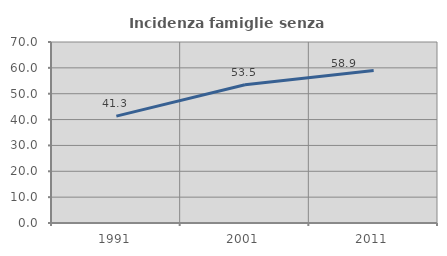
| Category | Incidenza famiglie senza nuclei |
|---|---|
| 1991.0 | 41.317 |
| 2001.0 | 53.459 |
| 2011.0 | 58.94 |